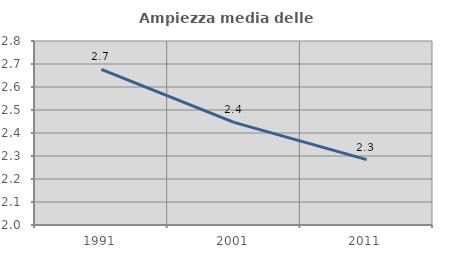
| Category | Ampiezza media delle famiglie |
|---|---|
| 1991.0 | 2.677 |
| 2001.0 | 2.446 |
| 2011.0 | 2.284 |